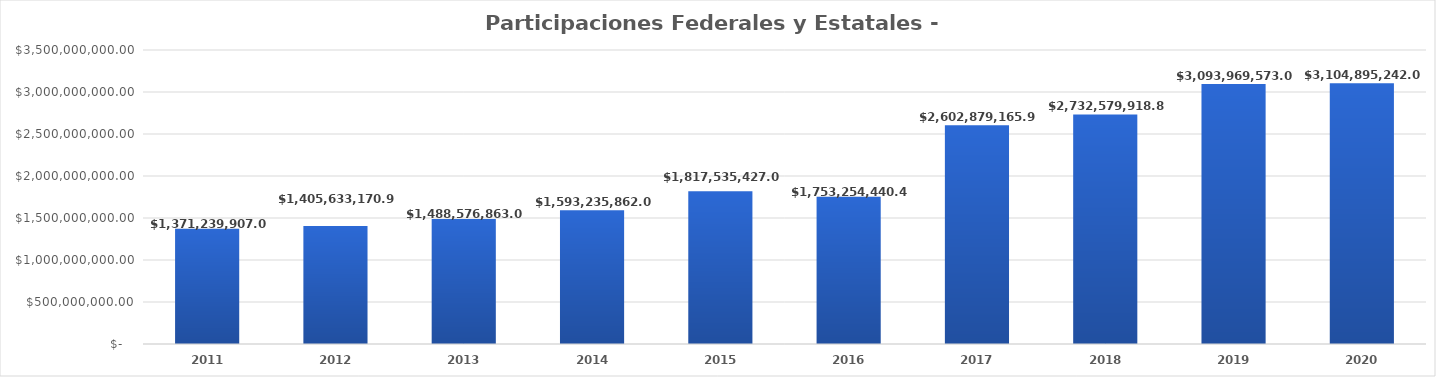
| Category | Participaciones Federales y Estatales - Ramo 28 |
|---|---|
| 2011.0 | 1371239907 |
| 2012.0 | 1405633170.9 |
| 2013.0 | 1488576863 |
| 2014.0 | 1593235862 |
| 2015.0 | 1817535427 |
| 2016.0 | 1753254440.43 |
| 2017.0 | 2602879165.99 |
| 2018.0 | 2732579918.84 |
| 2019.0 | 3093969573 |
| 2020.0 | 3104895242 |